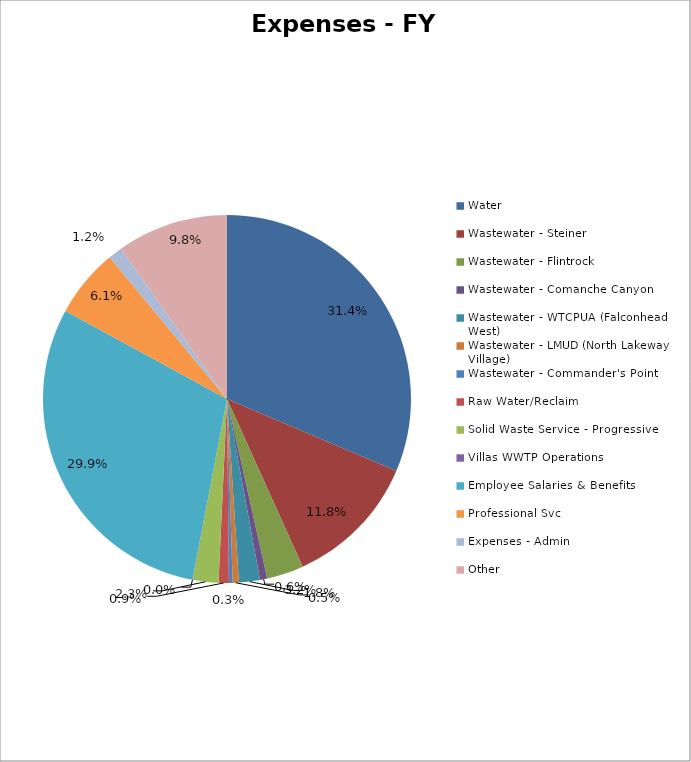
| Category | Series 0 |
|---|---|
| Water | 0.314 |
| Wastewater - Steiner | 0.118 |
| Wastewater - Flintrock | 0.032 |
| Wastewater - Comanche Canyon | 0.006 |
| Wastewater - WTCPUA (Falconhead West) | 0.018 |
| Wastewater - LMUD (North Lakeway Village) | 0.005 |
| Wastewater - Commander's Point | 0.003 |
| Raw Water/Reclaim | 0.009 |
| Solid Waste Service - Progressive | 0.023 |
| Villas WWTP Operations | 0 |
| Employee Salaries & Benefits | 0.299 |
| Professional Svc | 0.061 |
| Expenses - Admin | 0.012 |
| Other | 0.098 |